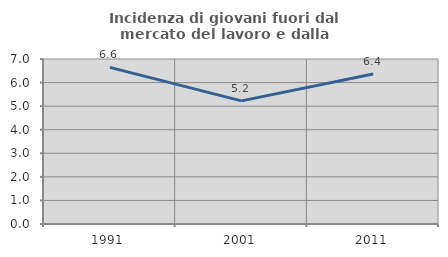
| Category | Incidenza di giovani fuori dal mercato del lavoro e dalla formazione  |
|---|---|
| 1991.0 | 6.645 |
| 2001.0 | 5.222 |
| 2011.0 | 6.362 |